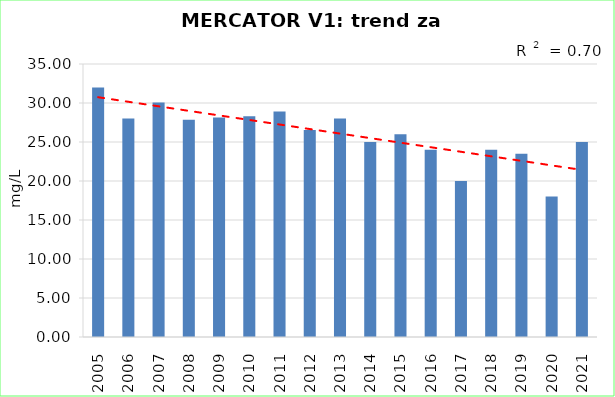
| Category | Vsota |
|---|---|
| 2005 | 32 |
| 2006 | 28.025 |
| 2007 | 30.075 |
| 2008 | 27.85 |
| 2009 | 28.15 |
| 2010 | 28.3 |
| 2011 | 28.9 |
| 2012 | 26.55 |
| 2013 | 28 |
| 2014 | 25 |
| 2015 | 26 |
| 2016 | 24 |
| 2017 | 20 |
| 2018 | 24 |
| 2019 | 23.5 |
| 2020 | 18 |
| 2021 | 25 |